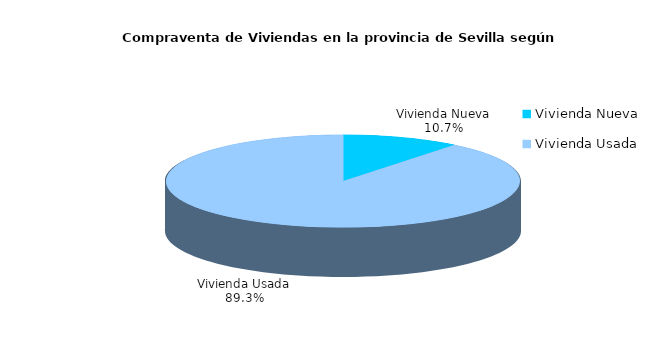
| Category | Series 0 | Series 1 |
|---|---|---|
| Vivienda Nueva | 122 | 0.107 |
| Vivienda Usada | 1017 | 0.893 |